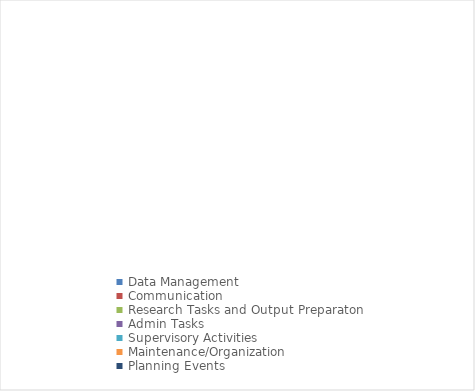
| Category | Series 0 |
|---|---|
| Data Management | 0 |
| Communication | 0 |
| Research Tasks and Output Preparaton | 0 |
| Admin Tasks | 0 |
| Supervisory Activities | 0 |
| Maintenance/Organization | 0 |
| Planning Events | 0 |